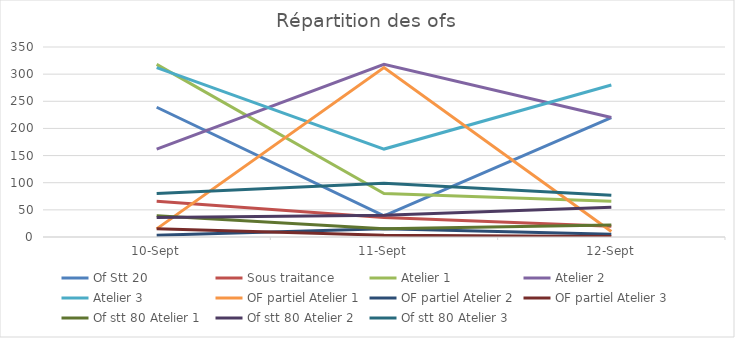
| Category | Of Stt 20 | Sous traitance | Atelier 1 | Atelier 2 | Atelier 3 | OF partiel Atelier 1 | OF partiel Atelier 2 | OF partiel Atelier 3 | Of stt 80 Atelier 1 | Of stt 80 Atelier 2 | Of stt 80 Atelier 3 |
|---|---|---|---|---|---|---|---|---|---|---|---|
| 2019-09-10 | 239 | 66 | 318 | 162 | 312 | 15 | 3 | 15 | 39 | 36 | 80 |
| 2019-09-11 | 39 | 36 | 80 | 318 | 162 | 312 | 15 | 3 | 15 | 40 | 99 |
| 2019-09-12 | 220 | 20 | 66 | 220 | 280 | 10 | 5 | 1 | 22 | 55 | 77 |